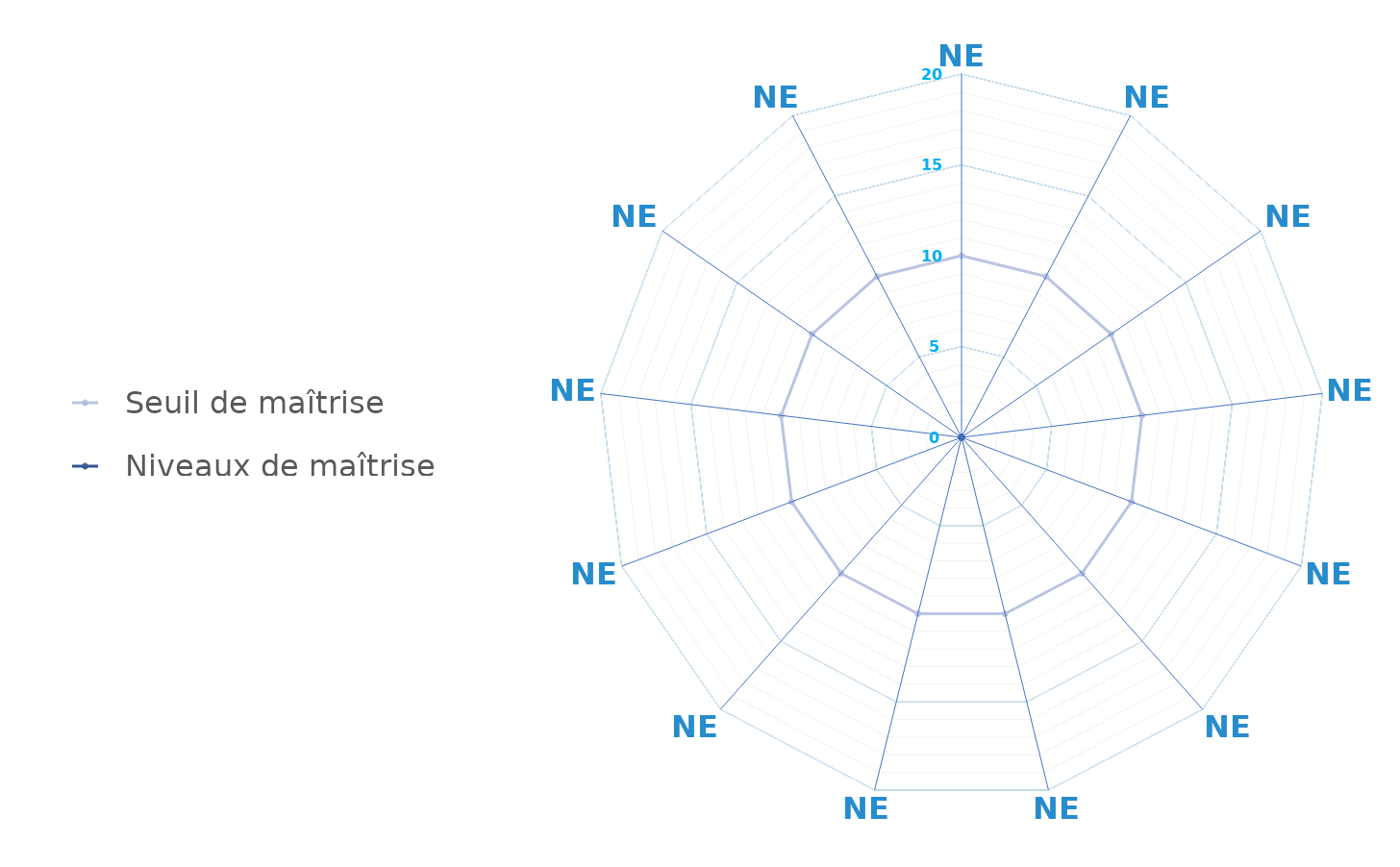
| Category |   Seuil de maîtrise |   Niveaux de maîtrise atteints |
|---|---|---|
| NE | 10 | 0 |
| NE | 10 | 0 |
| NE | 10 | 0 |
| NE | 10 | 0 |
| NE | 10 | 0 |
| NE | 10 | 0 |
| NE | 10 | 0 |
| NE | 10 | 0 |
| NE | 10 | 0 |
| NE | 10 | 0 |
| NE | 10 | 0 |
| NE | 10 | 0 |
| NE | 10 | 0 |